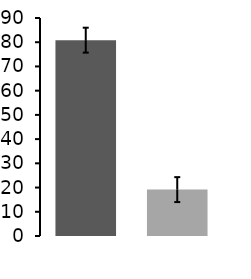
| Category | Average |
|---|---|
| Under | 80.848 |
| Outside | 19.152 |